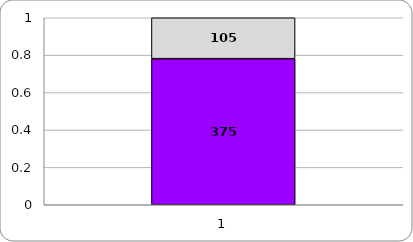
| Category | Series 0 | Series 1 |
|---|---|---|
| 0 | 375 | 105 |